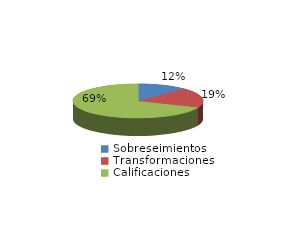
| Category | Series 0 |
|---|---|
| Sobreseimientos | 146 |
| Transformaciones | 231 |
| Calificaciones | 820 |